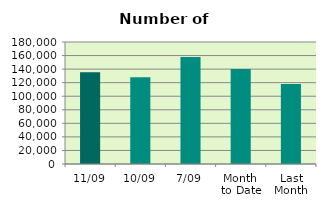
| Category | Series 0 |
|---|---|
| 11/09 | 135504 |
| 10/09 | 128074 |
| 7/09 | 157858 |
| Month 
to Date | 140235.714 |
| Last
Month | 118077.217 |